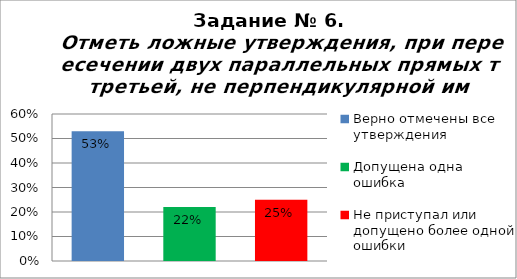
| Category | Отметь ложные утверждения, при пересечении двух параллельных прямых третьей, не перпендикулярной им. |
|---|---|
| Верно отмечены все утверждения | 0.53 |
| Допущена одна ошибка | 0.22 |
| Не приступал или допущено более одной ошибки | 0.25 |